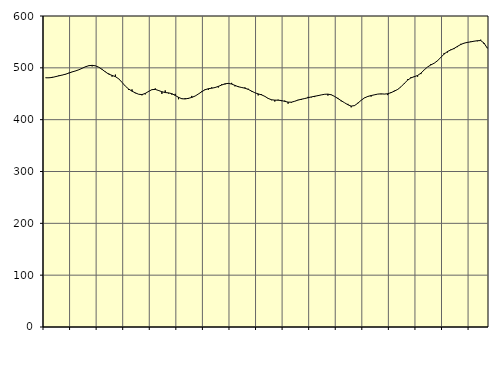
| Category | Piggar | Series 1 |
|---|---|---|
| nan | 480.3 | 480.8 |
| 87.0 | 480.5 | 480.75 |
| 87.0 | 482.5 | 481.49 |
| 87.0 | 482.3 | 483.02 |
| nan | 485.6 | 484.6 |
| 88.0 | 485.9 | 486.1 |
| 88.0 | 487.1 | 487.77 |
| 88.0 | 490.5 | 489.87 |
| nan | 492.6 | 492.14 |
| 89.0 | 493.8 | 494.07 |
| 89.0 | 496.4 | 496.28 |
| 89.0 | 499 | 499.15 |
| nan | 502.5 | 502.1 |
| 90.0 | 503.6 | 504.16 |
| 90.0 | 502.8 | 504.78 |
| 90.0 | 504.2 | 503.87 |
| nan | 501.3 | 501.18 |
| 91.0 | 497.9 | 496.98 |
| 91.0 | 492.7 | 492.05 |
| 91.0 | 489.1 | 487.88 |
| nan | 482.9 | 485.37 |
| 92.0 | 486.9 | 483.03 |
| 92.0 | 478.5 | 478.78 |
| 92.0 | 472 | 471.93 |
| nan | 464.7 | 464.64 |
| 93.0 | 457.4 | 459.09 |
| 93.0 | 458.4 | 455 |
| 93.0 | 451 | 451.74 |
| nan | 449.1 | 449.03 |
| 94.0 | 447 | 448.38 |
| 94.0 | 448.8 | 450.68 |
| 94.0 | 455.3 | 454.5 |
| nan | 457.6 | 457.9 |
| 95.0 | 460.3 | 458.4 |
| 95.0 | 457 | 456.24 |
| 95.0 | 449.7 | 453.9 |
| nan | 456.4 | 452.33 |
| 96.0 | 450.5 | 451.67 |
| 96.0 | 448.2 | 450.16 |
| 96.0 | 449.8 | 446.8 |
| nan | 439.4 | 443.11 |
| 97.0 | 441.3 | 440.37 |
| 97.0 | 441.7 | 439.96 |
| 97.0 | 440.1 | 441.18 |
| nan | 445.8 | 442.87 |
| 98.0 | 445.6 | 445.59 |
| 98.0 | 449.7 | 449.51 |
| 98.0 | 455.1 | 453.93 |
| nan | 458.7 | 457.76 |
| 99.0 | 457.6 | 459.71 |
| 99.0 | 462.3 | 460.67 |
| 99.0 | 462 | 461.98 |
| nan | 462.1 | 464.2 |
| 0.0 | 468.2 | 466.81 |
| 0.0 | 468 | 469.2 |
| 0.0 | 469.1 | 470.01 |
| nan | 471 | 468.73 |
| 1.0 | 464.3 | 466.13 |
| 1.0 | 464.6 | 463.54 |
| 1.0 | 462.7 | 462.09 |
| nan | 462.2 | 460.71 |
| 2.0 | 459.7 | 458.42 |
| 2.0 | 454.4 | 455.12 |
| 2.0 | 451.9 | 451.87 |
| nan | 446.8 | 449.71 |
| 3.0 | 449.2 | 447.92 |
| 3.0 | 445.3 | 444.98 |
| 3.0 | 440.4 | 441.01 |
| nan | 437.6 | 438.41 |
| 4.0 | 435 | 437.69 |
| 4.0 | 438.6 | 437.55 |
| 4.0 | 435.7 | 436.87 |
| nan | 436.8 | 435.29 |
| 5.0 | 430.8 | 433.82 |
| 5.0 | 432.7 | 433.72 |
| 5.0 | 435.3 | 435.51 |
| nan | 438.2 | 437.81 |
| 6.0 | 438.1 | 439.36 |
| 6.0 | 440.4 | 440.75 |
| 6.0 | 444 | 442.36 |
| nan | 443 | 443.87 |
| 7.0 | 443.6 | 445.15 |
| 7.0 | 445.8 | 446.34 |
| 7.0 | 447.6 | 447.76 |
| nan | 449.2 | 448.97 |
| 8.0 | 446.5 | 449.27 |
| 8.0 | 447.5 | 448.02 |
| 8.0 | 444.5 | 444.87 |
| nan | 442 | 440.78 |
| 9.0 | 435.5 | 436.61 |
| 9.0 | 432.6 | 432.68 |
| 9.0 | 430.5 | 428.74 |
| nan | 423.8 | 426.16 |
| 10.0 | 426.7 | 427.13 |
| 10.0 | 432.5 | 431.69 |
| 10.0 | 437.6 | 437.37 |
| nan | 442.3 | 441.95 |
| 11.0 | 445.6 | 444.8 |
| 11.0 | 444.6 | 446.51 |
| 11.0 | 448.2 | 447.89 |
| nan | 449.4 | 449.35 |
| 12.0 | 449.1 | 449.78 |
| 12.0 | 449.3 | 449.42 |
| 12.0 | 447.4 | 450.03 |
| nan | 453.1 | 452.1 |
| 13.0 | 455.9 | 455.04 |
| 13.0 | 457.9 | 458.33 |
| 13.0 | 463.3 | 463.39 |
| nan | 469 | 470.01 |
| 14.0 | 477.9 | 476.2 |
| 14.0 | 482.1 | 480.63 |
| 14.0 | 484 | 482.93 |
| nan | 482.9 | 485.28 |
| 15.0 | 487.9 | 489.71 |
| 15.0 | 496.3 | 496.03 |
| 15.0 | 501.7 | 501.72 |
| nan | 507.3 | 505.61 |
| 16.0 | 509.1 | 508.95 |
| 16.0 | 513.2 | 513.73 |
| 16.0 | 520.4 | 520.09 |
| nan | 528.7 | 526.65 |
| 17.0 | 529.6 | 531.51 |
| 17.0 | 535.3 | 534.48 |
| 17.0 | 536.2 | 537.42 |
| nan | 540 | 541.37 |
| 18.0 | 546.3 | 545.03 |
| 18.0 | 547.3 | 547.63 |
| 18.0 | 548.4 | 549.1 |
| nan | 551 | 550.09 |
| 19.0 | 551.6 | 551.39 |
| 19.0 | 551.3 | 552.31 |
| 19.0 | 554.3 | 552.67 |
| nan | 546.1 | 547.72 |
| 20.0 | 538.7 | 537.88 |